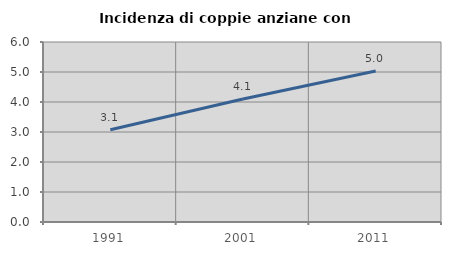
| Category | Incidenza di coppie anziane con figli |
|---|---|
| 1991.0 | 3.073 |
| 2001.0 | 4.1 |
| 2011.0 | 5.032 |